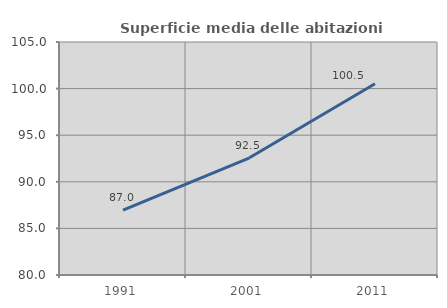
| Category | Superficie media delle abitazioni occupate |
|---|---|
| 1991.0 | 86.961 |
| 2001.0 | 92.547 |
| 2011.0 | 100.529 |